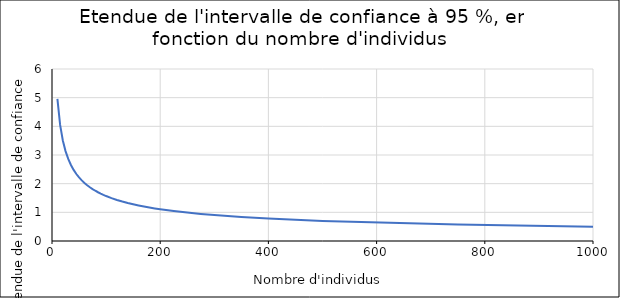
| Category | étendue de l'IC95 |
|---|---|
| 10.0 | 4.958 |
| 15.0 | 4.049 |
| 20.0 | 3.506 |
| 25.0 | 3.136 |
| 30.0 | 2.863 |
| 35.0 | 2.65 |
| 40.0 | 2.479 |
| 45.0 | 2.337 |
| 50.0 | 2.217 |
| 55.0 | 2.114 |
| 60.0 | 2.024 |
| 65.0 | 1.945 |
| 70.0 | 1.874 |
| 75.0 | 1.811 |
| 80.0 | 1.753 |
| 85.0 | 1.701 |
| 90.0 | 1.653 |
| 95.0 | 1.609 |
| 100.0 | 1.568 |
| 110.0 | 1.495 |
| 120.0 | 1.431 |
| 130.0 | 1.375 |
| 140.0 | 1.325 |
| 150.0 | 1.28 |
| 160.0 | 1.24 |
| 170.0 | 1.203 |
| 180.0 | 1.169 |
| 190.0 | 1.138 |
| 200.0 | 1.109 |
| 225.0 | 1.045 |
| 250.0 | 0.992 |
| 275.0 | 0.946 |
| 300.0 | 0.905 |
| 350.0 | 0.838 |
| 400.0 | 0.784 |
| 500.0 | 0.701 |
| 750.0 | 0.573 |
| 1000.0 | 0.496 |